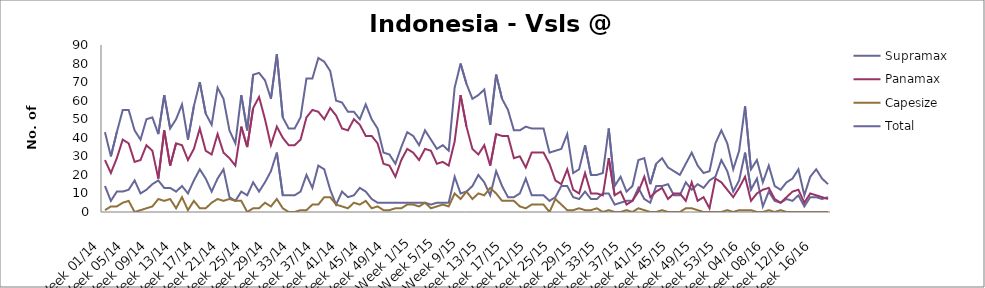
| Category | Supramax | Panamax | Capesize | Total |
|---|---|---|---|---|
| Week 01/14 | 14 | 28 | 1 | 43 |
| Week 02/14 | 6 | 21 | 3 | 30 |
| Week 03/14 | 11 | 29 | 3 | 43 |
| Week 04/14 | 11 | 39 | 5 | 55 |
| Week 05/14 | 12 | 37 | 6 | 55 |
| Week 06/14 | 17 | 27 | 0 | 44 |
| Week 07/14 | 10 | 28 | 1 | 39 |
| Week 08/14 | 12 | 36 | 2 | 50 |
| Week 09/14 | 15 | 33 | 3 | 51 |
| Week 10/14 | 17 | 18 | 7 | 42 |
| Week 11/14 | 13 | 44 | 6 | 63 |
| Week 12/14 | 13 | 25 | 7 | 45 |
| Week 13/14 | 11 | 37 | 2 | 50 |
| Week 14/14 | 14 | 36 | 8 | 58 |
| Week 15/14 | 10 | 28 | 1 | 39 |
| Week 16/14 | 17 | 34 | 6 | 57 |
| Week 17/14 | 23 | 45 | 2 | 70 |
| Week 18/14 | 18 | 33 | 2 | 53 |
| Week 19/14 | 11 | 31 | 5 | 47 |
| Week 20/14 | 18 | 42 | 7 | 67 |
| Week 21/14 | 23 | 32 | 6 | 61 |
| Week 22/14 | 8 | 29 | 7 | 44 |
| Week 23/14 | 6 | 25 | 6 | 37 |
| Week 24/14 | 11 | 46 | 6 | 63 |
| Week 25/14 | 9 | 35 | 0 | 44 |
| Week 26/14 | 16 | 56 | 2 | 74 |
| Week 27/14 | 11 | 62 | 2 | 75 |
| Week 28/14 | 16 | 50 | 5 | 71 |
| Week 29/14 | 22 | 36 | 3 | 61 |
| Week 30/14 | 32 | 46 | 7 | 85 |
| Week 31/14 | 9 | 40 | 2 | 51 |
| Week 32/14 | 9 | 36 | 0 | 45 |
| Week 33/14 | 9 | 36 | 0 | 45 |
| Week 34/14 | 11 | 39 | 1 | 51 |
| Week 35/14 | 20 | 51 | 1 | 72 |
| Week 36/14 | 13 | 55 | 4 | 72 |
| Week 37/14 | 25 | 54 | 4 | 83 |
| Week 38/14 | 23 | 50 | 8 | 81 |
| Week 39/14 | 12 | 56 | 8 | 76 |
| Week 40/14 | 4 | 52 | 4 | 60 |
| Week 41/14 | 11 | 45 | 3 | 59 |
| Week 42/14 | 8 | 44 | 2 | 54 |
| Week 43/14 | 9 | 50 | 5 | 54 |
| Week 44/14 | 13 | 47 | 4 | 50 |
| Week 45/14 | 11 | 41 | 6 | 58 |
| Week 46/14 | 7 | 41 | 2 | 50 |
| Week 47/14 | 5 | 37 | 3 | 45 |
| Week 48/14 | 5 | 26 | 1 | 32 |
| Week 49/14 | 5 | 25 | 1 | 31 |
| Week 50/14 | 5 | 19 | 2 | 26 |
| Week 51/14 | 5 | 28 | 2 | 35 |
| Week 52/14 | 5 | 34 | 4 | 43 |
| Week 1/15 | 5 | 32 | 4 | 41 |
| Week 2/15 | 5 | 28 | 3 | 36 |
| Week 3/15 | 5 | 34 | 5 | 44 |
| Week 4/15 | 4 | 33 | 2 | 39 |
| Week 5/15 | 5 | 26 | 3 | 34 |
| Week 6/15 | 5 | 27 | 4 | 36 |
| Week 7/15 | 5 | 25 | 3 | 33 |
| Week 8/15 | 19 | 38 | 10 | 67 |
| Week 9/15 | 10 | 63 | 7 | 80 |
| Week 10/15 | 11 | 46 | 11 | 69 |
| Week 11/15 | 14 | 34 | 7 | 61 |
| Week 12/15 | 20 | 31 | 10 | 63 |
| Week 13/15 | 16 | 36 | 9 | 66 |
| Week 14/15 | 9 | 25 | 13 | 47 |
| Week 15/15 | 22 | 42 | 10 | 74 |
| Week 16/15 | 14 | 41 | 6 | 61 |
| Week 17/15 | 8 | 41 | 6 | 55 |
| Week 18/15 | 8 | 29 | 6 | 44 |
| Week 19/15 | 10 | 30 | 3 | 44 |
| Week 20/15 | 18 | 24 | 2 | 46 |
| Week 21/15 | 9 | 32 | 4 | 45 |
| Week 22/15 | 9 | 32 | 4 | 45 |
| Week 23/15 | 9 | 32 | 4 | 45 |
| Week 24/15 | 6 | 26 | 0 | 32 |
| Week 25/15 | 8 | 17 | 7 | 33 |
| Week 26/15 | 14 | 15 | 4 | 34 |
| Week 27/15 | 14 | 23 | 1 | 42 |
| Week 28/15 | 8 | 12 | 1 | 21 |
| Week 29/15 | 7 | 10 | 2 | 23 |
| Week 30/15 | 11 | 21 | 1 | 36 |
| Week 31/15 | 7 | 10 | 1 | 20 |
| Week 32/15 | 7 | 10 | 2 | 20 |
| Week 33/15 | 10 | 9 | 0 | 21 |
| Week 34/15 | 10 | 29 | 1 | 45 |
| Week 35/15 | 4 | 9 | 0 | 14 |
| Week 36/15 | 5 | 11 | 0 | 19 |
| Week 37/15 | 6 | 4 | 1 | 11 |
| Week 38/15 | 6 | 6 | 0 | 14 |
| Week 39/15 | 13 | 11 | 2 | 28 |
| Week 40/15 | 7 | 19 | 1 | 29 |
| Week 41/15 | 5 | 8 | 0 | 15 |
| Week 42/15 | 14 | 11 | 0 | 26 |
| Week 43/15 | 14 | 13 | 1 | 29 |
| Week 44/15 | 15 | 7 | 0 | 24 |
| Week 45/15 | 9 | 10 | 0 | 22 |
| Week 46/15 | 9 | 10 | 0 | 20 |
| Week 47/15 | 16 | 6 | 2 | 26 |
| Week 48/15 | 12 | 16 | 2 | 32 |
| Week 49/15 | 15 | 6 | 1 | 25 |
| Week 50/15 | 13 | 8 | 0 | 21 |
| Week 51/15 | 17 | 2 | 0 | 22 |
| Week 52/15 | 19 | 18 | 0 | 37 |
| Week 53/15 | 28 | 16 | 0 | 44 |
| Week 01/16 | 22 | 12 | 1 | 37 |
| Week 02/16 | 11 | 8 | 0 | 23 |
| Week 03/16 | 17 | 13 | 1 | 33 |
| Week 04/16 | 32 | 19 | 1 | 57 |
| Week 05/16 | 12 | 6 | 1 | 23 |
| Week 06/16 | 18 | 10 | 0 | 28 |
| Week 07/16 | 3 | 12 | 0 | 16 |
| Week 08/16 | 11 | 13 | 1 | 25 |
| Week 09/16 | 6 | 7 | 0 | 14 |
| Week 10/16 | 5 | 5 | 1 | 12 |
| Week 11/16 | 7 | 8 | 0 | 16 |
| Week 12/16 | 6 | 11 | 0 | 18 |
| Week 13/16 | 9 | 12 | 0 | 23 |
| Week 14/16 | 3 | 5 | 0 | 9 |
| Week 15/16 | 8 | 10 | 0 | 19 |
| Week 16/16 | 8 | 9 | 0 | 23 |
| Week 17/16 | 7 | 8 | 0 | 18 |
| Week 18/16 | 8 | 7 | 0 | 15 |